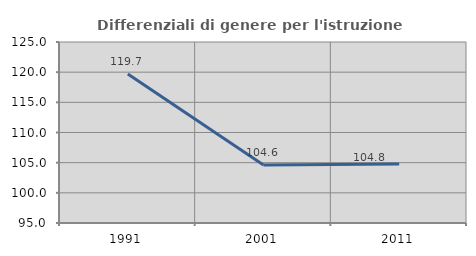
| Category | Differenziali di genere per l'istruzione superiore |
|---|---|
| 1991.0 | 119.691 |
| 2001.0 | 104.618 |
| 2011.0 | 104.765 |